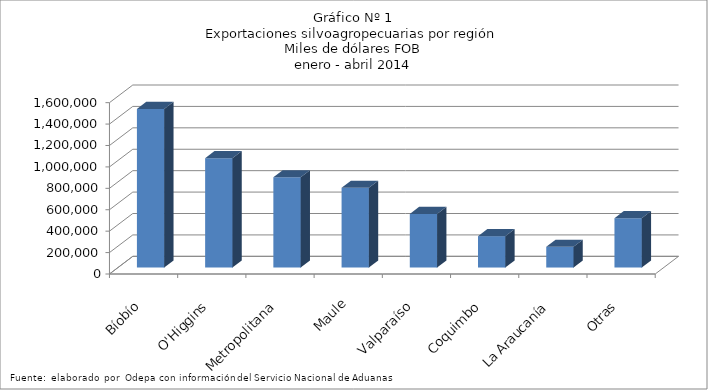
| Category | Series 0 |
|---|---|
| Bíobío | 1481498.384 |
| O'Higgins | 1021299.835 |
| Metropolitana | 842086.758 |
| Maule | 744258.649 |
| Valparaíso | 500848.058 |
| Coquimbo | 293052.844 |
| La Araucanía | 193974.143 |
| Otras | 460885.374 |